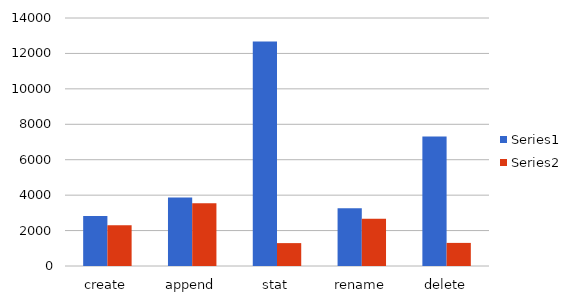
| Category | Series 0 | Series 1 |
|---|---|---|
| create | 2816 | 2302 |
| append | 3871 | 3539 |
| stat | 12680 | 1292 |
| rename | 3265 | 2664 |
| delete | 7309 | 1304 |